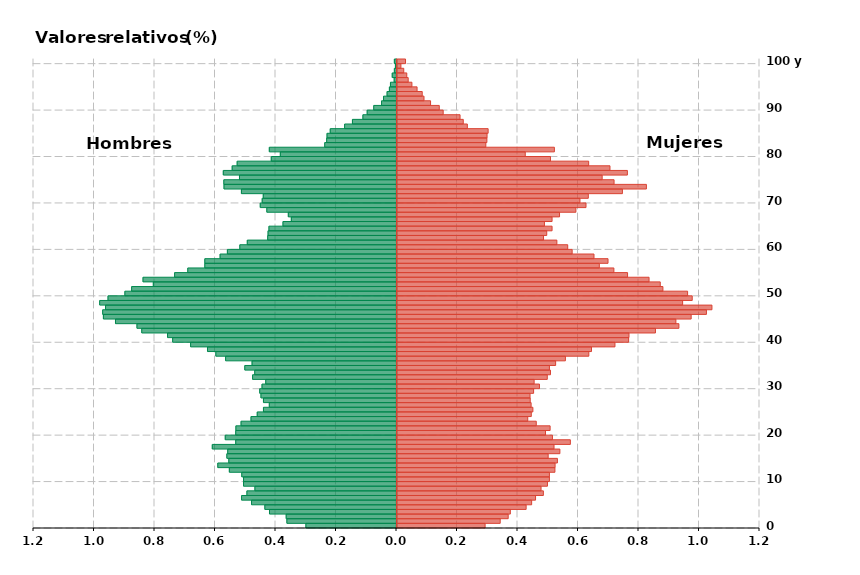
| Category | Hombres | Mujeres |
|---|---|---|
| 0 | -0.299 | 0.291 |
| 1 | -0.362 | 0.341 |
| 2 | -0.365 | 0.368 |
| 3 | -0.42 | 0.375 |
| 4 | -0.435 | 0.427 |
| 5 | -0.479 | 0.445 |
| 6 | -0.512 | 0.458 |
| 7 | -0.494 | 0.484 |
| 8 | -0.468 | 0.476 |
| 9 | -0.506 | 0.497 |
| 10 | -0.506 | 0.504 |
| 11 | -0.511 | 0.504 |
| 12 | -0.553 | 0.522 |
| 13 | -0.591 | 0.523 |
| 14 | -0.554 | 0.53 |
| 15 | -0.561 | 0.5 |
| 16 | -0.558 | 0.538 |
| 17 | -0.609 | 0.519 |
| 18 | -0.531 | 0.573 |
| 19 | -0.566 | 0.514 |
| 20 | -0.531 | 0.491 |
| 21 | -0.531 | 0.506 |
| 22 | -0.514 | 0.46 |
| 23 | -0.481 | 0.432 |
| 24 | -0.46 | 0.444 |
| 25 | -0.44 | 0.449 |
| 26 | -0.42 | 0.443 |
| 27 | -0.44 | 0.44 |
| 28 | -0.448 | 0.44 |
| 29 | -0.452 | 0.452 |
| 30 | -0.445 | 0.471 |
| 31 | -0.432 | 0.453 |
| 32 | -0.476 | 0.497 |
| 33 | -0.469 | 0.507 |
| 34 | -0.501 | 0.504 |
| 35 | -0.477 | 0.524 |
| 36 | -0.565 | 0.557 |
| 37 | -0.597 | 0.634 |
| 38 | -0.625 | 0.643 |
| 39 | -0.681 | 0.721 |
| 40 | -0.74 | 0.766 |
| 41 | -0.757 | 0.767 |
| 42 | -0.842 | 0.854 |
| 43 | -0.858 | 0.932 |
| 44 | -0.929 | 0.922 |
| 45 | -0.969 | 0.972 |
| 46 | -0.971 | 1.023 |
| 47 | -0.962 | 1.041 |
| 48 | -0.981 | 0.944 |
| 49 | -0.954 | 0.976 |
| 50 | -0.898 | 0.961 |
| 51 | -0.876 | 0.879 |
| 52 | -0.804 | 0.87 |
| 53 | -0.838 | 0.833 |
| 54 | -0.733 | 0.762 |
| 55 | -0.69 | 0.717 |
| 56 | -0.634 | 0.669 |
| 57 | -0.634 | 0.698 |
| 58 | -0.583 | 0.651 |
| 59 | -0.559 | 0.579 |
| 60 | -0.518 | 0.564 |
| 61 | -0.493 | 0.528 |
| 62 | -0.426 | 0.484 |
| 63 | -0.425 | 0.495 |
| 64 | -0.422 | 0.513 |
| 65 | -0.375 | 0.487 |
| 66 | -0.348 | 0.513 |
| 67 | -0.358 | 0.537 |
| 68 | -0.429 | 0.591 |
| 69 | -0.45 | 0.625 |
| 70 | -0.444 | 0.605 |
| 71 | -0.44 | 0.632 |
| 72 | -0.513 | 0.745 |
| 73 | -0.57 | 0.824 |
| 74 | -0.571 | 0.718 |
| 75 | -0.519 | 0.678 |
| 76 | -0.573 | 0.762 |
| 77 | -0.543 | 0.704 |
| 78 | -0.527 | 0.634 |
| 79 | -0.414 | 0.507 |
| 80 | -0.384 | 0.424 |
| 81 | -0.42 | 0.52 |
| 82 | -0.237 | 0.294 |
| 83 | -0.231 | 0.297 |
| 84 | -0.23 | 0.298 |
| 85 | -0.219 | 0.301 |
| 86 | -0.171 | 0.233 |
| 87 | -0.146 | 0.219 |
| 88 | -0.111 | 0.208 |
| 89 | -0.097 | 0.153 |
| 90 | -0.075 | 0.14 |
| 91 | -0.049 | 0.111 |
| 92 | -0.043 | 0.089 |
| 93 | -0.031 | 0.083 |
| 94 | -0.023 | 0.066 |
| 95 | -0.02 | 0.049 |
| 96 | -0.008 | 0.037 |
| 97 | -0.014 | 0.032 |
| 98 | -0.007 | 0.022 |
| 99 | -0.004 | 0.013 |
| 100 | -0.007 | 0.028 |